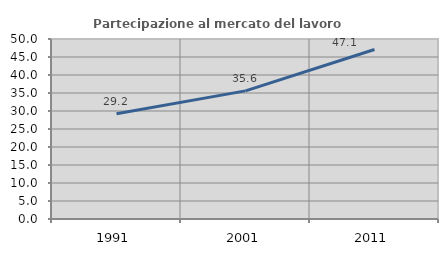
| Category | Partecipazione al mercato del lavoro  femminile |
|---|---|
| 1991.0 | 29.217 |
| 2001.0 | 35.592 |
| 2011.0 | 47.087 |